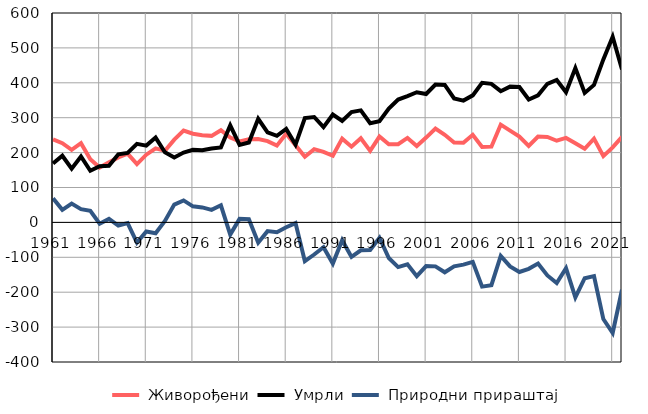
| Category |  Живорођени |  Умрли |  Природни прираштај |
|---|---|---|---|
| 1961.0 | 238 | 169 | 69 |
| 1962.0 | 227 | 191 | 36 |
| 1963.0 | 208 | 154 | 54 |
| 1964.0 | 227 | 189 | 38 |
| 1965.0 | 181 | 148 | 33 |
| 1966.0 | 157 | 161 | -4 |
| 1967.0 | 172 | 162 | 10 |
| 1968.0 | 186 | 195 | -9 |
| 1969.0 | 197 | 199 | -2 |
| 1970.0 | 167 | 225 | -58 |
| 1971.0 | 194 | 220 | -26 |
| 1972.0 | 212 | 243 | -31 |
| 1973.0 | 205 | 201 | 4 |
| 1974.0 | 237 | 186 | 51 |
| 1975.0 | 263 | 200 | 63 |
| 1976.0 | 254 | 208 | 46 |
| 1977.0 | 250 | 207 | 43 |
| 1978.0 | 248 | 212 | 36 |
| 1979.0 | 264 | 215 | 49 |
| 1980.0 | 243 | 278 | -35 |
| 1981.0 | 232 | 222 | 10 |
| 1982.0 | 238 | 229 | 9 |
| 1983.0 | 239 | 297 | -58 |
| 1984.0 | 233 | 258 | -25 |
| 1985.0 | 220 | 248 | -28 |
| 1986.0 | 254 | 268 | -14 |
| 1987.0 | 221 | 223 | -2 |
| 1988.0 | 188 | 299 | -111 |
| 1989.0 | 210 | 302 | -92 |
| 1990.0 | 202 | 273 | -71 |
| 1991.0 | 191 | 309 | -118 |
| 1992.0 | 240 | 291 | -51 |
| 1993.0 | 217 | 316 | -99 |
| 1994.0 | 241 | 321 | -80 |
| 1995.0 | 205 | 284 | -79 |
| 1996.0 | 246 | 290 | -44 |
| 1997.0 | 224 | 326 | -102 |
| 1998.0 | 224 | 352 | -128 |
| 1999.0 | 242 | 362 | -120 |
| 2000.0 | 219 | 373 | -154 |
| 2001.0 | 243 | 368 | -125 |
| 2002.0 | 269 | 395 | -126 |
| 2003.0 | 251 | 394 | -143 |
| 2004.0 | 229 | 355 | -126 |
| 2005.0 | 228 | 349 | -121 |
| 2006.0 | 251 | 364 | -113 |
| 2007.0 | 216 | 400 | -184 |
| 2008.0 | 217 | 397 | -180 |
| 2009.0 | 280 | 376 | -96 |
| 2010.0 | 263 | 389 | -126 |
| 2011.0 | 246 | 388 | -142 |
| 2012.0 | 219 | 352 | -133 |
| 2013.0 | 246 | 364 | -118 |
| 2014.0 | 245 | 397 | -152 |
| 2015.0 | 234 | 408 | -174 |
| 2016.0 | 242 | 373 | -131 |
| 2017.0 | 227 | 442 | -215 |
| 2018.0 | 211 | 371 | -160 |
| 2019.0 | 240 | 394 | -154 |
| 2020.0 | 190 | 467 | -277 |
| 2021.0 | 215 | 532 | -317 |
| 2022.0 | 245 | 438 | -193 |